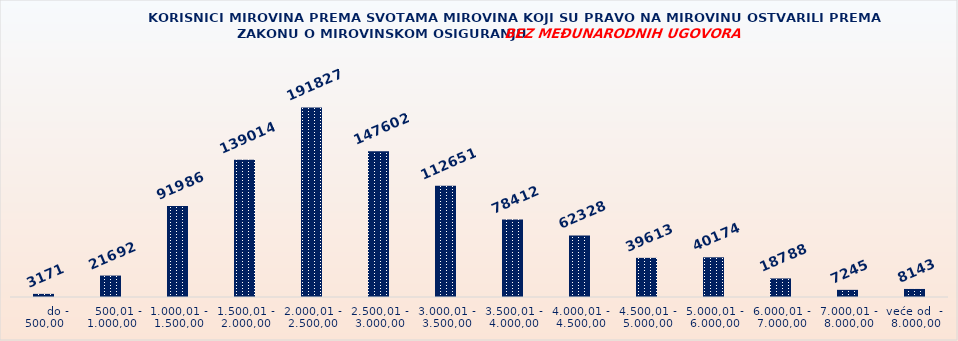
| Category | KORISNICI MIROVINA PREMA VRSTAMA I SVOTAMA MIROVINA KOJI SU PRAVO NA MIROVINU OSTVARILI PREMA ZAKONU O MIROVINSKOM OSIGURANJU 
BEZ MEĐUNARODNIH UGOVORA |
|---|---|
|       do - 500,00 | 3171 |
|    500,01 - 1.000,00 | 21692 |
| 1.000,01 - 1.500,00 | 91986 |
| 1.500,01 - 2.000,00 | 139014 |
| 2.000,01 - 2.500,00 | 191827 |
| 2.500,01 - 3.000,00 | 147602 |
| 3.000,01 - 3.500,00 | 112651 |
| 3.500,01 - 4.000,00 | 78412 |
| 4.000,01 - 4.500,00 | 62328 |
| 4.500,01 - 5.000,00 | 39613 |
| 5.000,01 - 6.000,00 | 40174 |
| 6.000,01 - 7.000,00 | 18788 |
| 7.000,01 - 8.000,00 | 7245 |
| veće od  -  8.000,00 | 8143 |